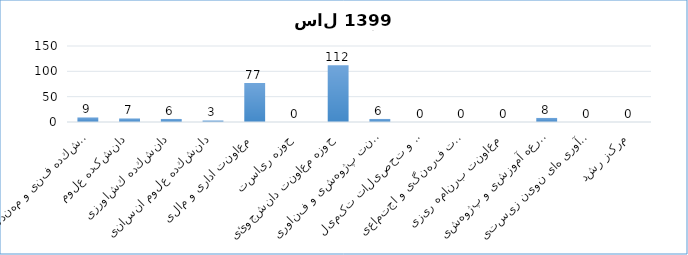
| Category | جمع کل |
|---|---|
| دانشكده فنی و مهندسی | 9 |
| دانشکده علوم | 7 |
| دانشكده كشاورزی | 6 |
| دانشكده علوم انسانی | 3 |
| معاونت اداری و مالی | 77 |
| حوزه ریاست | 0 |
| حوزه معاونت دانشجوئی | 112 |
| معاونت پژوهشی و فناوری | 6 |
| معاونت آموزشی و تحصیلات تکمیلی | 0 |
| حوزه معاونت فرهنگی و اجتماعی | 0 |
| معاونت برنامه ریزی | 0 |
| مزرعه آموزشی و پژوهشی | 8 |
| پژو هشکده فنآوری های نوین زیستی | 0 |
| مرکز رشد | 0 |